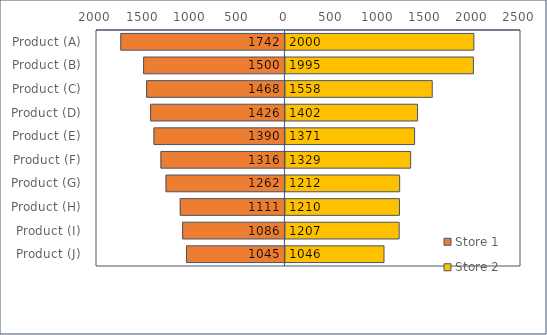
| Category | Store 1 | Store 2 |
|---|---|---|
| Product (A)  | -1742 | 2000 |
| Product (B)  | -1500 | 1995 |
| Product (C)  | -1468 | 1558 |
| Product (D)  | -1426 | 1402 |
| Product (E)  | -1390 | 1371 |
| Product (F)  | -1316 | 1329 |
| Product (G)  | -1262 | 1212 |
| Product (H)  | -1111 | 1210 |
| Product (I)  | -1086 | 1207 |
| Product (J)  | -1045 | 1046 |